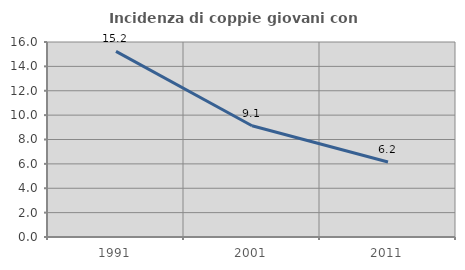
| Category | Incidenza di coppie giovani con figli |
|---|---|
| 1991.0 | 15.23 |
| 2001.0 | 9.132 |
| 2011.0 | 6.156 |